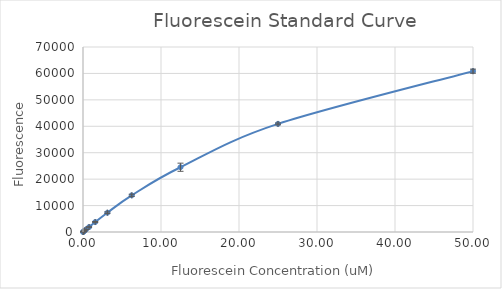
| Category | Series 0 |
|---|---|
| 50.0 | 60853.75 |
| 25.0 | 40900.5 |
| 12.5 | 24505.75 |
| 6.25 | 13879 |
| 3.125 | 7294.25 |
| 1.5625 | 3767.5 |
| 0.78125 | 1879 |
| 0.390625 | 966 |
| 0.1953125 | 489 |
| 0.09765625 | 245.5 |
| 0.048828125 | 116.75 |
| 0.0 | 4.25 |